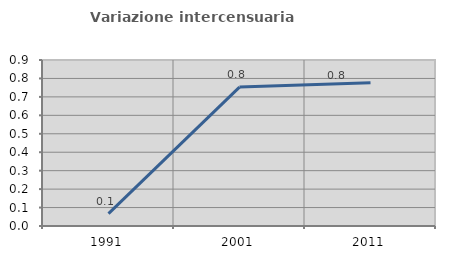
| Category | Variazione intercensuaria annua |
|---|---|
| 1991.0 | 0.067 |
| 2001.0 | 0.753 |
| 2011.0 | 0.776 |